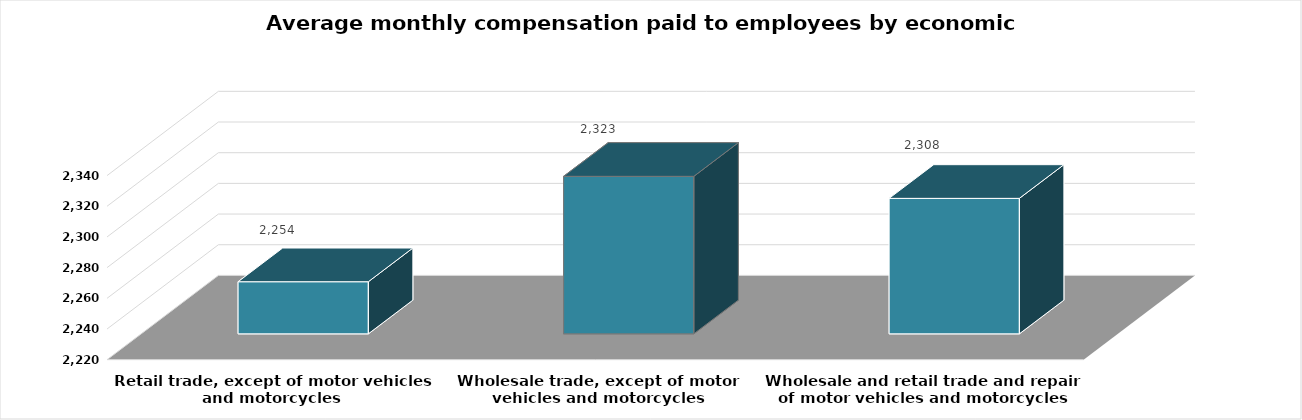
| Category | متوسط التعويضات  |
|---|---|
| Wholesale and retail trade and repair of motor vehicles and motorcycles | 2308.314 |
| Wholesale trade, except of motor vehicles and motorcycles | 2322.679 |
| Retail trade, except of motor vehicles and motorcycles | 2253.983 |